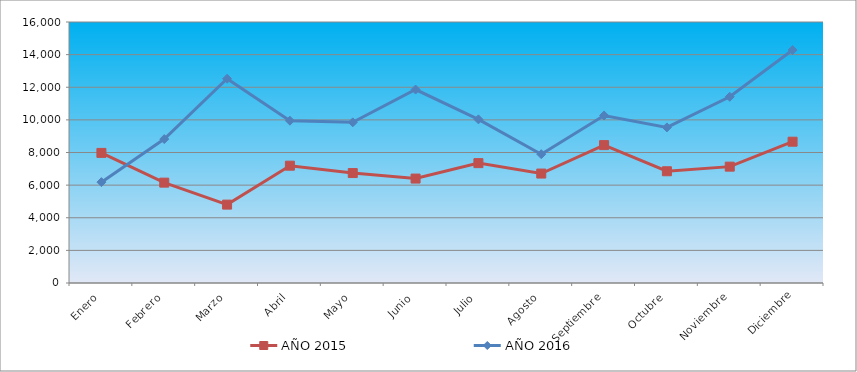
| Category | AÑO 2015 | AÑO 2016 |
|---|---|---|
| Enero | 7976 | 6182 |
| Febrero | 6153 | 8822 |
| Marzo | 4805 | 12523 |
| Abril | 7192 | 9951 |
| Mayo | 6740 | 9849 |
| Junio | 6402 | 11860 |
| Julio | 7348 | 10033 |
| Agosto | 6709 | 7896 |
| Septiembre | 8453 | 10270 |
| Octubre | 6850 | 9538 |
| Noviembre | 7133 | 11416 |
| Diciembre | 8662 | 14282 |